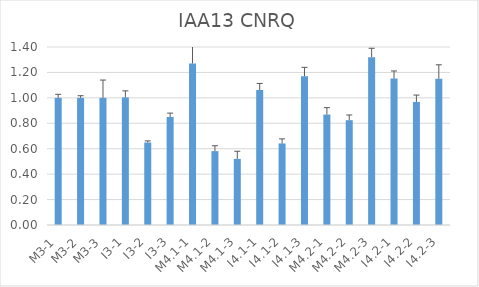
| Category | IAA13 CNRQ |
|---|---|
| M3-1 | 1 |
| M3-2 | 1 |
| M3-3 | 1 |
| I3-1 | 1.004 |
| I3-2 | 0.649 |
| I3-3 | 0.85 |
| M4.1-1 | 1.271 |
| M4.1-2 | 0.581 |
| M4.1-3 | 0.52 |
| I4.1-1 | 1.062 |
| I4.1-2 | 0.642 |
| I4.1-3 | 1.17 |
| M4.2-1 | 0.869 |
| M4.2-2 | 0.824 |
| M4.2-3 | 1.32 |
| I4.2-1 | 1.152 |
| I4.2-2 | 0.968 |
| I4.2-3 | 1.15 |